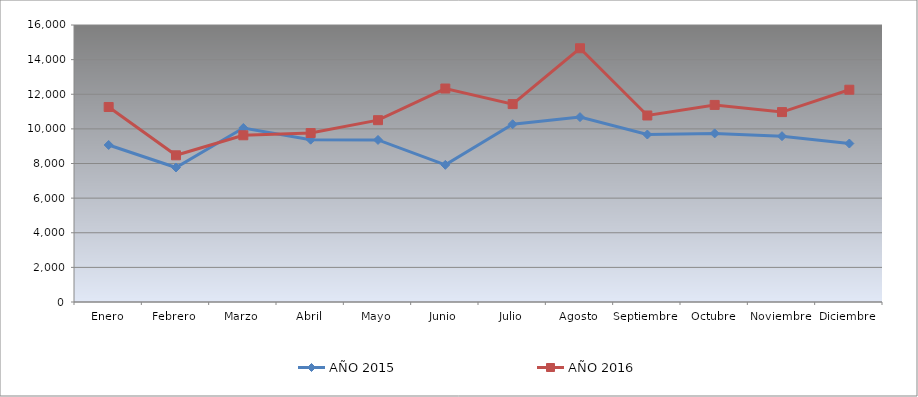
| Category | AÑO 2015 | AÑO 2016 |
|---|---|---|
| Enero | 9070.382 | 11264.651 |
| Febrero | 7769.676 | 8473.066 |
| Marzo | 10051.825 | 9630.253 |
| Abril | 9376.003 | 9758.26 |
| Mayo | 9360.54 | 10502.751 |
| Junio | 7922.486 | 12330.697 |
| Julio | 10267.396 | 11430.549 |
| Agosto | 10679.438 | 14656.336 |
| Septiembre | 9673.437 | 10774.127 |
| Octubre | 9739.837 | 11384.466 |
| Noviembre | 9577.021 | 10969.722 |
| Diciembre | 9154.064 | 12261.061 |